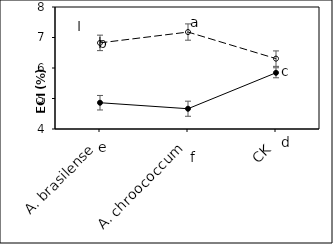
| Category | Bt | Xy |
|---|---|---|
|    A. brasilense | 4.862 | 6.823 |
|    A. chroococcum | 4.665 | 7.179 |
| CK | 5.844 | 6.307 |